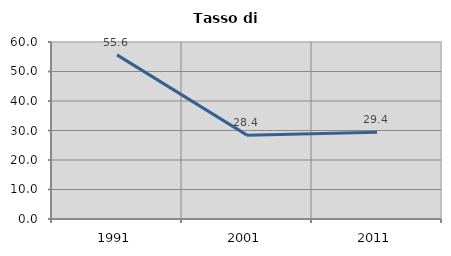
| Category | Tasso di disoccupazione   |
|---|---|
| 1991.0 | 55.638 |
| 2001.0 | 28.424 |
| 2011.0 | 29.412 |